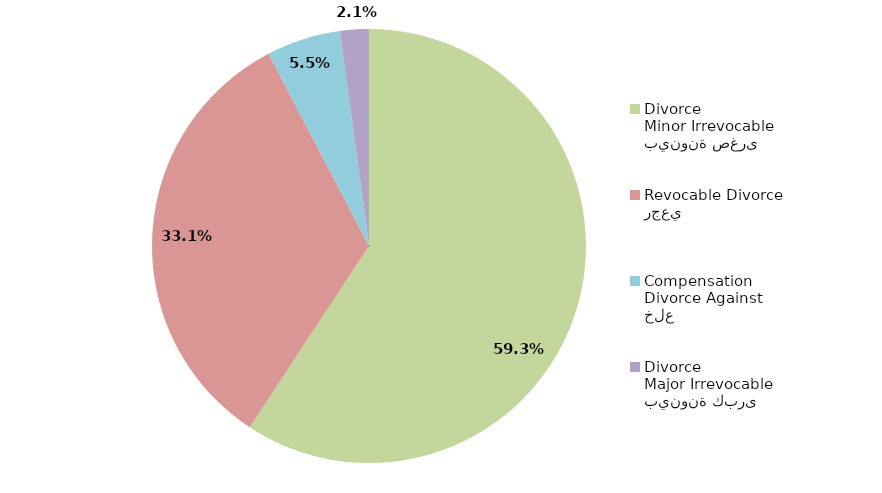
| Category | Series 1 |
|---|---|
| بينونة صغرى
Minor Irrevocable Divorce  | 59.265 |
| رجعي
Revocable Divorce  | 33.078 |
| خلع
Divorce Against Compensation | 5.513 |
| بينونة كبرى
Major Irrevocable Divorce  | 2.144 |